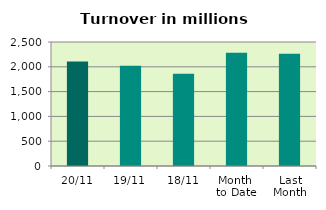
| Category | Series 0 |
|---|---|
| 20/11 | 2105.364 |
| 19/11 | 2021.227 |
| 18/11 | 1859.296 |
| Month 
to Date | 2282.779 |
| Last
Month | 2263.558 |